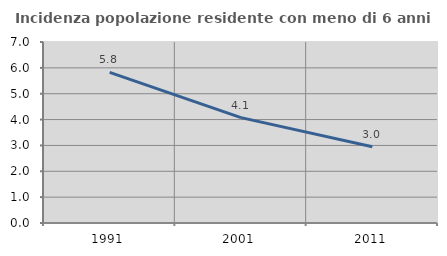
| Category | Incidenza popolazione residente con meno di 6 anni |
|---|---|
| 1991.0 | 5.827 |
| 2001.0 | 4.075 |
| 2011.0 | 2.951 |